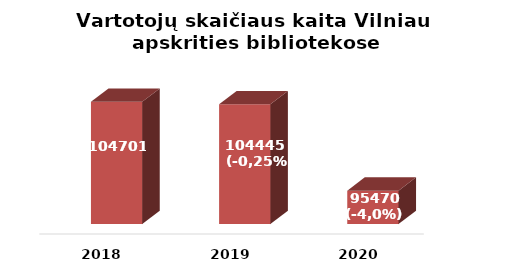
| Category | Series 0 |
|---|---|
| 2018.0 | 104701 |
| 2019.0 | 104445 |
| 2020.0 | 95470 |